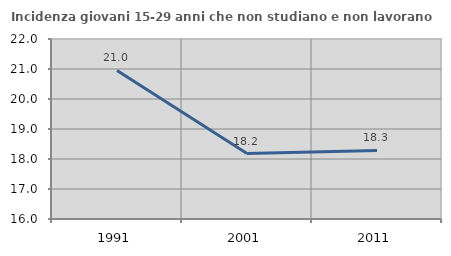
| Category | Incidenza giovani 15-29 anni che non studiano e non lavorano  |
|---|---|
| 1991.0 | 20.952 |
| 2001.0 | 18.182 |
| 2011.0 | 18.286 |